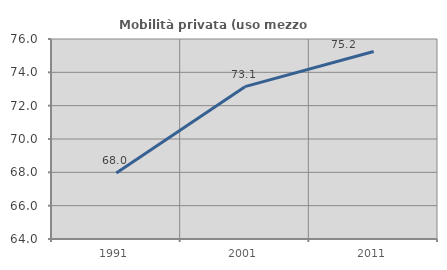
| Category | Mobilità privata (uso mezzo privato) |
|---|---|
| 1991.0 | 67.953 |
| 2001.0 | 73.14 |
| 2011.0 | 75.25 |